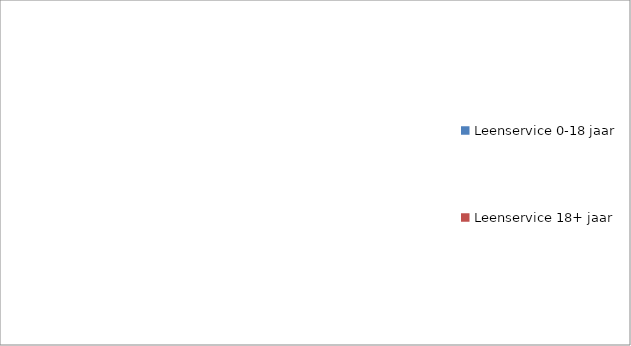
| Category | Series 0 |
|---|---|
| Leenservice 0-18 jaar | 0 |
| Leenservice 18+ jaar | 0 |